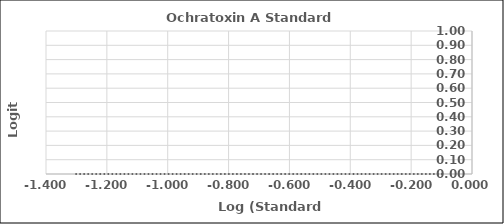
| Category | Series 0 |
|---|---|
| -1.3010299956639813 | 0 |
| -1.0 | 0 |
| -0.6989700043360187 | 0 |
| -0.3979400086720376 | 0 |
| -0.09691001300805639 | 0 |